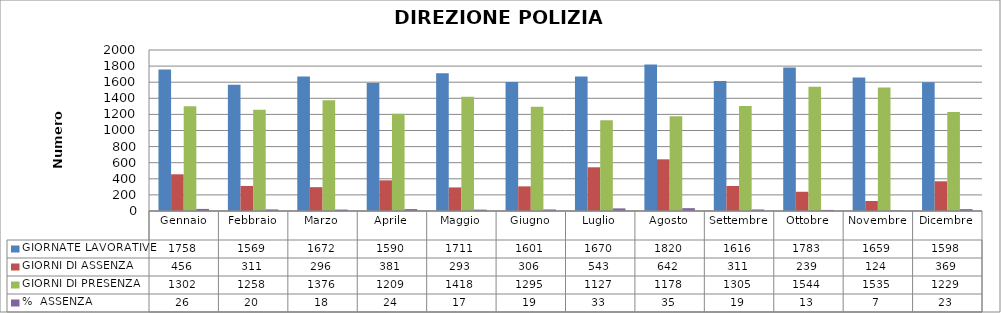
| Category | GIORNATE LAVORATIVE | GIORNI DI ASSENZA | GIORNI DI PRESENZA | %  ASSENZA |
|---|---|---|---|---|
| Gennaio | 1758 | 456 | 1302 | 25.939 |
| Febbraio | 1569 | 311 | 1258 | 19.822 |
| Marzo | 1672 | 296 | 1376 | 17.703 |
| Aprile | 1590 | 381 | 1209 | 23.962 |
| Maggio | 1711 | 293 | 1418 | 17.124 |
| Giugno | 1601 | 306 | 1295 | 19.113 |
| Luglio | 1670 | 543 | 1127 | 32.515 |
| Agosto | 1820 | 642 | 1178 | 35.275 |
| Settembre | 1616 | 311 | 1305 | 19.245 |
| Ottobre | 1783 | 239 | 1544 | 13.404 |
| Novembre | 1659 | 124 | 1535 | 7.474 |
| Dicembre | 1598 | 369 | 1229 | 23.091 |